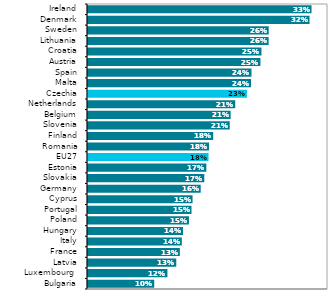
| Category | Series 1 |
|---|---|
| Bulgaria | 0.097 |
| Luxembourg  | 0.116 |
| Latvia | 0.129 |
| France | 0.134 |
| Italy | 0.137 |
| Hungary | 0.139 |
| Poland | 0.147 |
| Portugal | 0.151 |
| Cyprus | 0.152 |
| Germany | 0.164 |
| Slovakia | 0.17 |
| Estonia | 0.173 |
| EU27 | 0.176 |
| Romania | 0.177 |
| Finland | 0.183 |
| Slovenia | 0.207 |
| Belgium | 0.208 |
| Netherlands | 0.215 |
| Czechia | 0.232 |
| Malta | 0.238 |
| Spain | 0.238 |
| Austria | 0.251 |
| Croatia | 0.253 |
| Lithuania | 0.263 |
| Sweden | 0.264 |
| Denmark | 0.323 |
| Ireland | 0.326 |